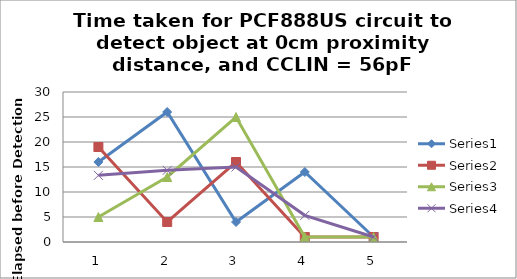
| Category | Series 0 | Series 1 | Series 2 | Series 3 |
|---|---|---|---|---|
| 0 | 16 | 19 | 5 | 13.333 |
| 1 | 26 | 4 | 13 | 14.333 |
| 2 | 4 | 16 | 25 | 15 |
| 3 | 14 | 1 | 1 | 5.333 |
| 4 | 1 | 1 | 1 | 1 |